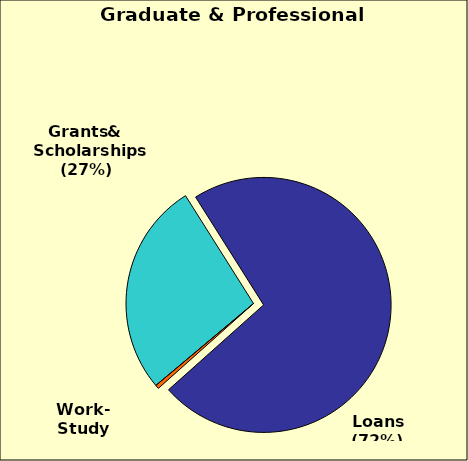
| Category | Series 0 |
|---|---|
| 0 | 0.272 |
| 1 | 0.724 |
| 2 | 0.005 |